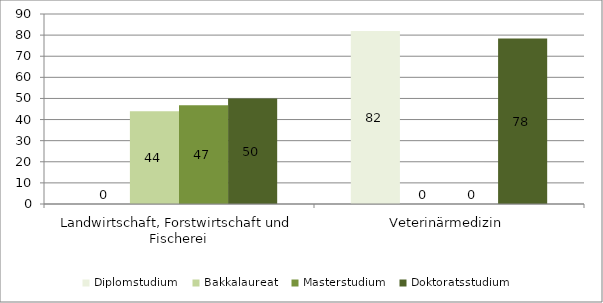
| Category | Diplomstudium  | Bakkalaureat  | Masterstudium  | Doktoratsstudium  |
|---|---|---|---|---|
| Landwirtschaft, Forstwirtschaft und Fischerei | 0 | 43.976 | 46.721 | 50 |
| Veterinärmedizin | 81.915 | 0 | 0 | 78.378 |